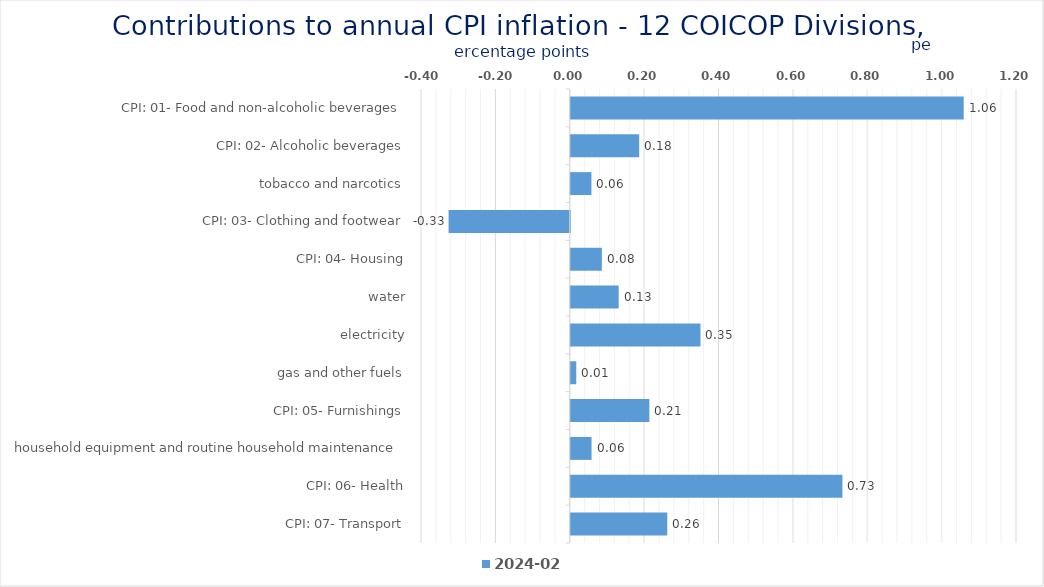
| Category | 2024-02 |
|---|---|
| CPI: 01- Food and non-alcoholic beverages | 1.057 |
| CPI: 02- Alcoholic beverages, tobacco and narcotics | 0.184 |
| CPI: 03- Clothing and footwear | 0.056 |
| CPI: 04- Housing, water, electricity, gas and other fuels | -0.326 |
| CPI: 05- Furnishings, household equipment and routine household maintenance | 0.084 |
| CPI: 06- Health | 0.129 |
| CPI: 07- Transport | 0.349 |
| CPI: 08- Communication | 0.015 |
| CPI: 09- Recreation and culture | 0.211 |
| CPI: 10- Education | 0.056 |
| CPI: 11- Restaurants and hotels | 0.731 |
| CPI: 12- Miscellaneous goods and services | 0.26 |